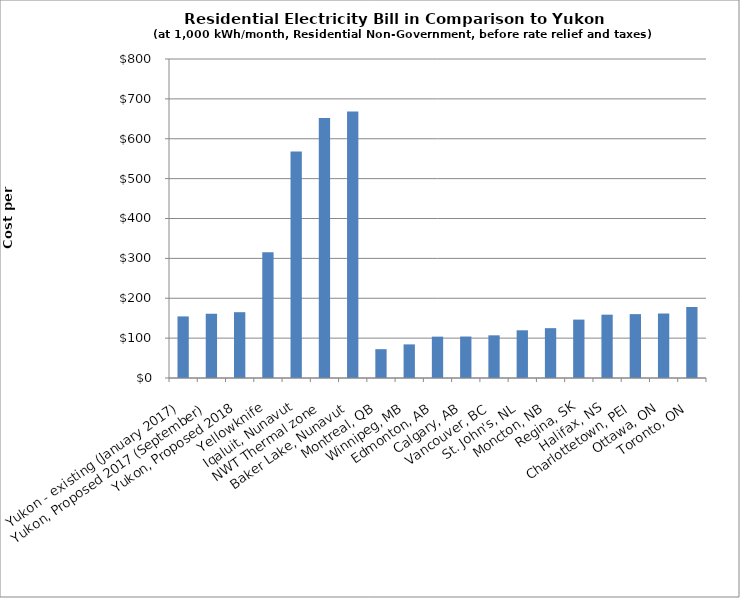
| Category | Monthly Bills before rate relief and taxes |
|---|---|
| Yukon - existing (January 2017) | 154.438 |
| Yukon, Proposed 2017 (September) | 161.356 |
| Yukon, Proposed 2018 | 165.037 |
| Yellowknife | 315.179 |
| Iqaluit, Nunavut | 568.3 |
| NWT Thermal zone | 651.9 |
| Baker Lake, Nunavut | 668.5 |
| Montreal, QB | 72.26 |
| Winnipeg, MB | 84.29 |
| Edmonton, AB | 103.69 |
| Calgary, AB | 104 |
| Vancouver, BC | 107.03 |
| St. John's, NL | 119.64 |
| Moncton, NB | 124.98 |
| Regina, SK | 146.45 |
| Halifax, NS | 158.83 |
| Charlottetown, PEI | 160.17 |
| Ottawa, ON | 161.52 |
| Toronto, ON | 178.08 |